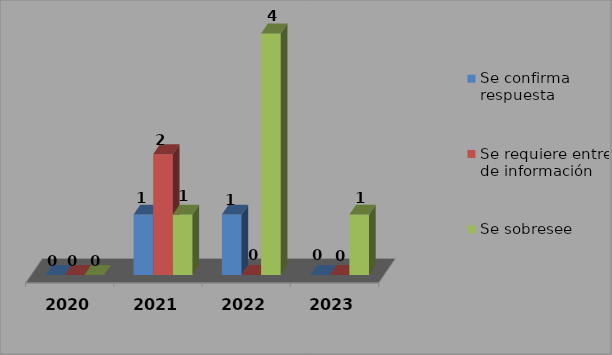
| Category | Se confirma respuesta | Se requiere entregar de información  | Se sobresee  |
|---|---|---|---|
| 2020.0 | 0 | 0 | 0 |
| 2021.0 | 1 | 2 | 1 |
| 2022.0 | 1 | 0 | 4 |
| 2023.0 | 0 | 0 | 1 |